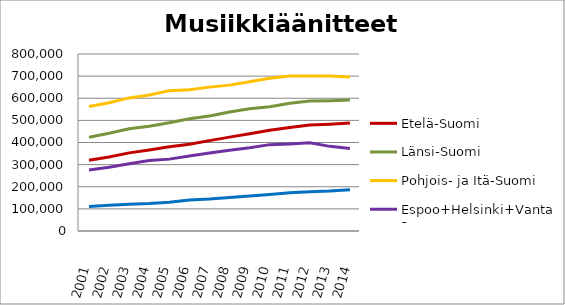
| Category | Etelä-Suomi | Länsi-Suomi | Pohjois- ja Itä-Suomi | Espoo+Helsinki+Vantaa | Muu Uusimaa |
|---|---|---|---|---|---|
| 2001.0 | 319420 | 423783 | 562300 | 275473 | 110668 |
| 2002.0 | 334521 | 441938 | 579962 | 288379 | 116043 |
| 2003.0 | 353170 | 462210 | 601577 | 304111 | 120899 |
| 2004.0 | 365915 | 473045 | 614744 | 318506 | 123954 |
| 2005.0 | 380546 | 488884 | 634367 | 324872 | 130331 |
| 2006.0 | 391853 | 507170 | 638442 | 338546 | 140537 |
| 2007.0 | 408401 | 519774 | 650292 | 352675 | 144706 |
| 2008.0 | 424244 | 537887 | 659334 | 365131 | 151936 |
| 2009.0 | 440009 | 552976 | 674182 | 376409 | 157832 |
| 2010.0 | 455148 | 561411 | 689912 | 390341 | 165268 |
| 2011.0 | 468172 | 577746 | 700818 | 393454 | 173071 |
| 2012.0 | 479262 | 587755 | 700543 | 398539 | 177673 |
| 2013.0 | 482970 | 588845 | 700196 | 382567 | 180529 |
| 2014.0 | 487914 | 591750 | 696322 | 373122 | 186193 |